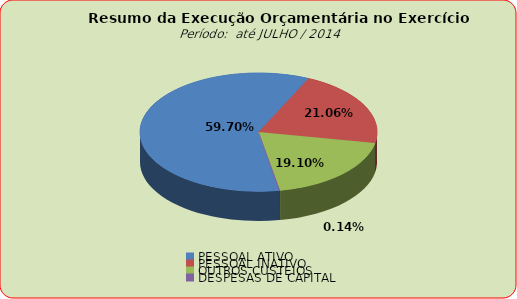
| Category | Series 0 |
|---|---|
| PESSOAL ATIVO | 70581517.85 |
| PESSOAL INATIVO | 24902794.69 |
| OUTROS CUSTEIOS | 22587279.54 |
| DESPESAS DE CAPITAL | 160771.97 |